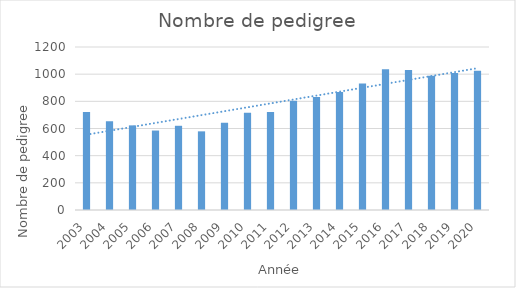
| Category | Series 0 |
|---|---|
| 2003.0 | 722 |
| 2004.0 | 653 |
| 2005.0 | 623 |
| 2006.0 | 585 |
| 2007.0 | 620 |
| 2008.0 | 579 |
| 2009.0 | 643 |
| 2010.0 | 716 |
| 2011.0 | 721 |
| 2012.0 | 804 |
| 2013.0 | 832 |
| 2014.0 | 868 |
| 2015.0 | 931 |
| 2016.0 | 1037 |
| 2017.0 | 1030 |
| 2018.0 | 989 |
| 2019.0 | 1008 |
| 2020.0 | 1025 |